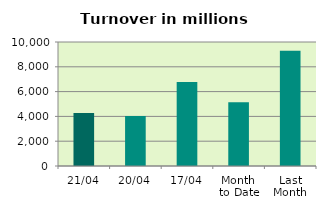
| Category | Series 0 |
|---|---|
| 21/04 | 4279.65 |
| 20/04 | 4027.098 |
| 17/04 | 6768.023 |
| Month 
to Date | 5142.783 |
| Last
Month | 9287.764 |